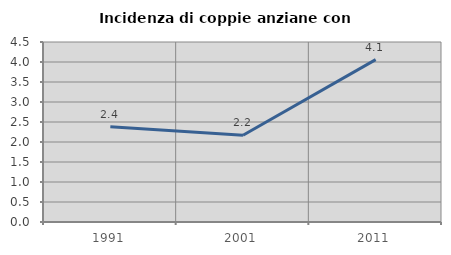
| Category | Incidenza di coppie anziane con figli |
|---|---|
| 1991.0 | 2.381 |
| 2001.0 | 2.17 |
| 2011.0 | 4.059 |